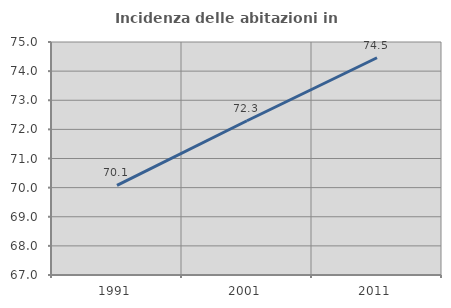
| Category | Incidenza delle abitazioni in proprietà  |
|---|---|
| 1991.0 | 70.076 |
| 2001.0 | 72.296 |
| 2011.0 | 74.46 |